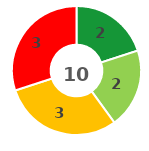
| Category | Series 0 |
|---|---|
| 0 | 2 |
| 1 | 2 |
| 2 | 3 |
| 3 | 3 |
| 4 | 0 |